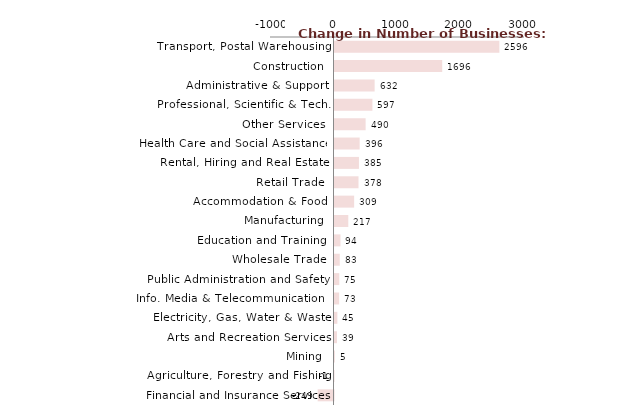
| Category | Series 0 |
|---|---|
| Transport, Postal Warehousing | 2596 |
| Construction | 1696 |
| Administrative & Support | 632 |
| Professional, Scientific & Tech. | 597 |
| Other Services | 490 |
| Health Care and Social Assistance | 396 |
| Rental, Hiring and Real Estate | 385 |
| Retail Trade | 378 |
| Accommodation & Food | 309 |
| Manufacturing | 217 |
| Education and Training | 94 |
| Wholesale Trade | 83 |
| Public Administration and Safety | 75 |
| Info. Media & Telecommunications | 73 |
| Electricity, Gas, Water & Waste | 45 |
| Arts and Recreation Services | 39 |
| Mining | 5 |
| Agriculture, Forestry and Fishing | -1 |
| Financial and Insurance Services | -249 |